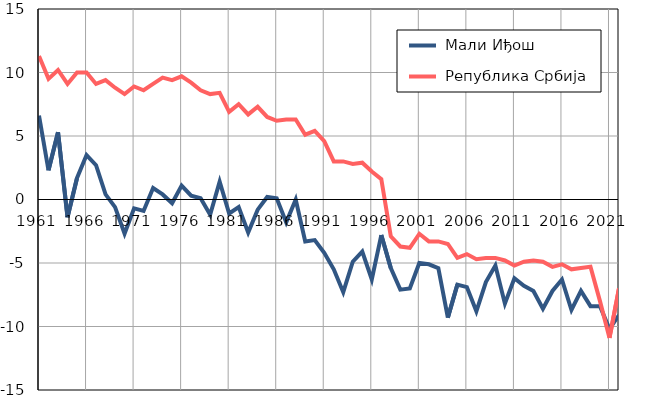
| Category |  Мали Иђош |  Република Србија |
|---|---|---|
| 1961.0 | 6.6 | 11.3 |
| 1962.0 | 2.3 | 9.5 |
| 1963.0 | 5.3 | 10.2 |
| 1964.0 | -1.4 | 9.1 |
| 1965.0 | 1.7 | 10 |
| 1966.0 | 3.5 | 10 |
| 1967.0 | 2.7 | 9.1 |
| 1968.0 | 0.4 | 9.4 |
| 1969.0 | -0.6 | 8.8 |
| 1970.0 | -2.7 | 8.3 |
| 1971.0 | -0.7 | 8.9 |
| 1972.0 | -0.9 | 8.6 |
| 1973.0 | 0.9 | 9.1 |
| 1974.0 | 0.4 | 9.6 |
| 1975.0 | -0.3 | 9.4 |
| 1976.0 | 1.1 | 9.7 |
| 1977.0 | 0.3 | 9.2 |
| 1978.0 | 0.1 | 8.6 |
| 1979.0 | -1.2 | 8.3 |
| 1980.0 | 1.4 | 8.4 |
| 1981.0 | -1.1 | 6.9 |
| 1982.0 | -0.6 | 7.5 |
| 1983.0 | -2.6 | 6.7 |
| 1984.0 | -0.8 | 7.3 |
| 1985.0 | 0.2 | 6.5 |
| 1986.0 | 0.1 | 6.2 |
| 1987.0 | -1.8 | 6.3 |
| 1988.0 | 0 | 6.3 |
| 1989.0 | -3.3 | 5.1 |
| 1990.0 | -3.2 | 5.4 |
| 1991.0 | -4.2 | 4.6 |
| 1992.0 | -5.5 | 3 |
| 1993.0 | -7.3 | 3 |
| 1994.0 | -4.9 | 2.8 |
| 1995.0 | -4.1 | 2.9 |
| 1996.0 | -6.3 | 2.2 |
| 1997.0 | -2.8 | 1.6 |
| 1998.0 | -5.4 | -2.9 |
| 1999.0 | -7.1 | -3.7 |
| 2000.0 | -7 | -3.8 |
| 2001.0 | -5 | -2.7 |
| 2002.0 | -5.1 | -3.3 |
| 2003.0 | -5.4 | -3.3 |
| 2004.0 | -9.3 | -3.5 |
| 2005.0 | -6.7 | -4.6 |
| 2006.0 | -6.9 | -4.3 |
| 2007.0 | -8.8 | -4.7 |
| 2008.0 | -6.5 | -4.6 |
| 2009.0 | -5.2 | -4.6 |
| 2010.0 | -8.2 | -4.8 |
| 2011.0 | -6.2 | -5.2 |
| 2012.0 | -6.8 | -4.9 |
| 2013.0 | -7.2 | -4.8 |
| 2014.0 | -8.6 | -4.9 |
| 2015.0 | -7.2 | -5.3 |
| 2016.0 | -6.3 | -5.1 |
| 2017.0 | -8.7 | -5.5 |
| 2018.0 | -7.2 | -5.4 |
| 2019.0 | -8.4 | -5.3 |
| 2020.0 | -8.4 | -8 |
| 2021.0 | -10.2 | -10.9 |
| 2022.0 | -9.1 | -7 |